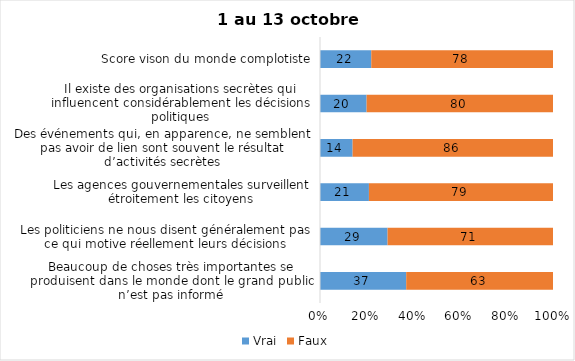
| Category | Vrai | Faux |
|---|---|---|
| Beaucoup de choses très importantes se produisent dans le monde dont le grand public n’est pas informé | 37 | 63 |
| Les politiciens ne nous disent généralement pas ce qui motive réellement leurs décisions | 29 | 71 |
| Les agences gouvernementales surveillent étroitement les citoyens | 21 | 79 |
| Des événements qui, en apparence, ne semblent pas avoir de lien sont souvent le résultat d’activités secrètes | 14 | 86 |
| Il existe des organisations secrètes qui influencent considérablement les décisions politiques | 20 | 80 |
| Score vison du monde complotiste | 22 | 78 |